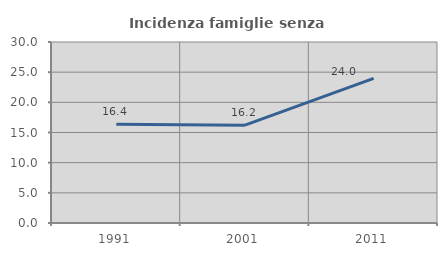
| Category | Incidenza famiglie senza nuclei |
|---|---|
| 1991.0 | 16.381 |
| 2001.0 | 16.208 |
| 2011.0 | 23.961 |